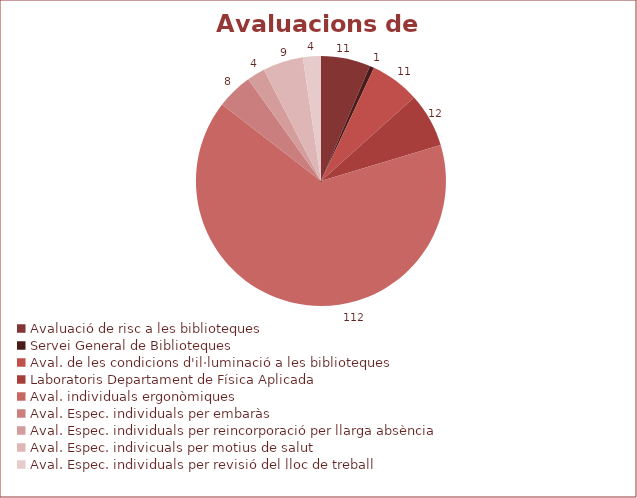
| Category | Series 0 |
|---|---|
| Avaluació de risc a les biblioteques | 11 |
| Servei General de Biblioteques | 1 |
| Aval. de les condicions d'il·luminació a les biblioteques | 11 |
| Laboratoris Departament de Física Aplicada | 12 |
| Aval. individuals ergonòmiques | 112 |
| Aval. Espec. individuals per embaràs | 8 |
| Aval. Espec. individuals per reincorporació per llarga absència | 4 |
| Aval. Espec. indivicuals per motius de salut | 9 |
| Aval. Espec. individuals per revisió del lloc de treball | 4 |